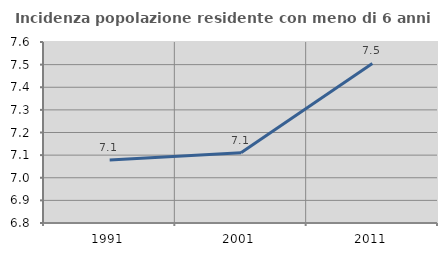
| Category | Incidenza popolazione residente con meno di 6 anni |
|---|---|
| 1991.0 | 7.079 |
| 2001.0 | 7.11 |
| 2011.0 | 7.505 |